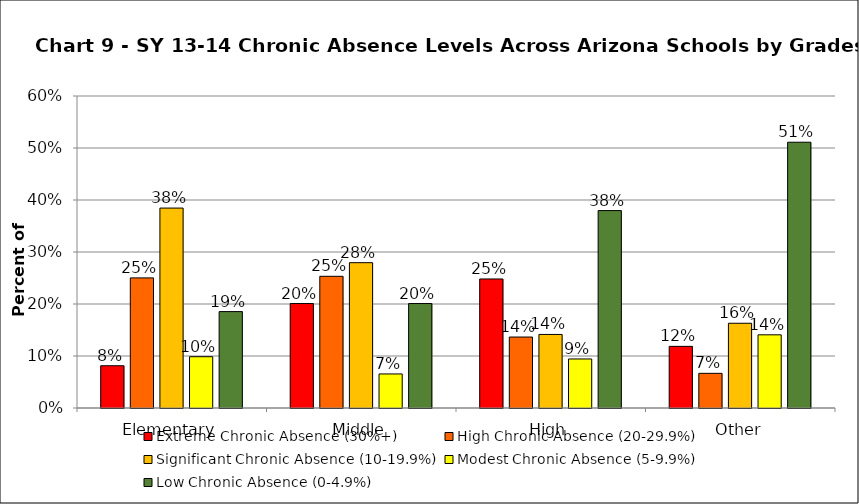
| Category | Extreme Chronic Absence (30%+) | High Chronic Absence (20-29.9%) | Significant Chronic Absence (10-19.9%) | Modest Chronic Absence (5-9.9%) | Low Chronic Absence (0-4.9%) |
|---|---|---|---|---|---|
| 0 | 0.081 | 0.25 | 0.384 | 0.099 | 0.185 |
| 1 | 0.201 | 0.253 | 0.279 | 0.066 | 0.201 |
| 2 | 0.248 | 0.136 | 0.141 | 0.094 | 0.38 |
| 3 | 0.119 | 0.067 | 0.163 | 0.141 | 0.511 |